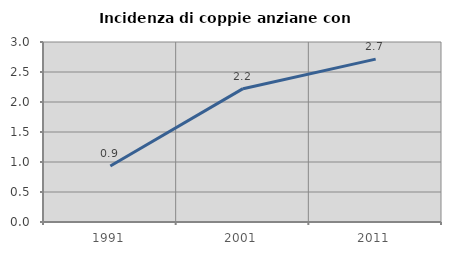
| Category | Incidenza di coppie anziane con figli |
|---|---|
| 1991.0 | 0.935 |
| 2001.0 | 2.222 |
| 2011.0 | 2.715 |